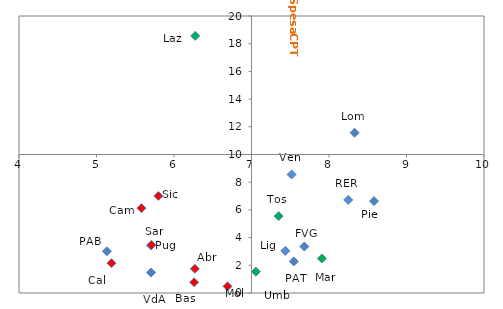
| Category | Series 0 |
|---|---|
| 8.58158390311088 | 6.637 |
| 5.7041679441717505 | 1.48 |
| 8.33038790577455 | 11.575 |
| 7.517421140283427 | 8.557 |
| 7.6814357192098655 | 3.356 |
| 7.436712626943038 | 3.042 |
| 8.247908845235045 | 6.718 |
| 7.350136582725661 | 5.551 |
| 7.056778988458354 | 1.539 |
| 7.907749697432426 | 2.491 |
| 6.274069439664124 | 18.566 |
| 6.269091300522443 | 1.748 |
| 6.6905757739858105 | 0.483 |
| 5.5797193491324455 | 6.125 |
| 5.701610930554757 | 3.436 |
| 6.259462232173301 | 0.777 |
| 5.1934002398860315 | 2.151 |
| 5.798107732559504 | 7.008 |
| 5.709422072387532 | 3.466 |
| 7.545993321021264 | 2.28 |
| 5.134246085942281 | 3.016 |